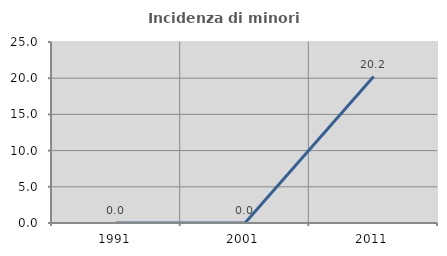
| Category | Incidenza di minori stranieri |
|---|---|
| 1991.0 | 0 |
| 2001.0 | 0 |
| 2011.0 | 20.225 |